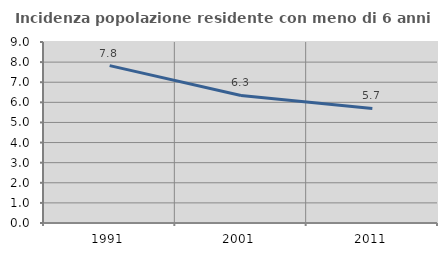
| Category | Incidenza popolazione residente con meno di 6 anni |
|---|---|
| 1991.0 | 7.826 |
| 2001.0 | 6.344 |
| 2011.0 | 5.695 |